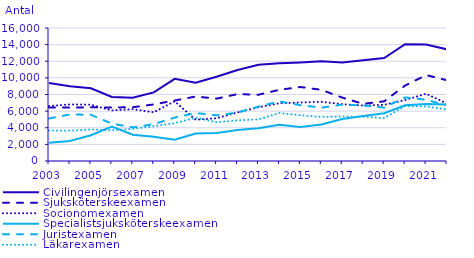
| Category | Civilingenjörsexamen                               | Sjuksköterskeexamen                                | Socionomexamen                                     | Specialistsjuksköterskeexamen                      | Juristexamen                                       | Läkarexamen                                        |
|---|---|---|---|---|---|---|
| 2003.0 | 9394 | 6451 | 6607 | 2193 | 5116 | 3661 |
| 2004.0 | 8998 | 6431 | 6807 | 2407 | 5599 | 3650 |
| 2005.0 | 8755 | 6456 | 6772 | 3095 | 5560 | 3788 |
| 2006.0 | 7711 | 6438 | 6085 | 4136 | 4499 | 3698 |
| 2007.0 | 7616 | 6466 | 6238 | 3169 | 4042 | 3878 |
| 2008.0 | 8249 | 6808 | 5862 | 2906 | 4432 | 4187 |
| 2009.0 | 9889 | 7276 | 7181 | 2551 | 5218 | 4548 |
| 2010.0 | 9407 | 7757 | 4960 | 3318 | 5769 | 5206 |
| 2011.0 | 10127 | 7504 | 5147 | 3378 | 5497 | 4658 |
| 2012.0 | 10948 | 8047 | 5844 | 3739 | 5826 | 4895 |
| 2013.0 | 11568 | 7976 | 6465 | 3931 | 6543 | 5006 |
| 2014.0 | 11750 | 8562 | 6945 | 4374 | 7174 | 5772 |
| 2015.0 | 11848 | 8902 | 7035 | 4081 | 6715 | 5499 |
| 2016.0 | 11992 | 8565 | 7119 | 4401 | 6417 | 5305 |
| 2017.0 | 11843 | 7629 | 6837 | 5056 | 6774 | 5353 |
| 2018.0 | 12129 | 6875 | 6675 | 5408 | 6686 | 5328 |
| 2019.0 | 12392 | 7178 | 6759 | 5754 | 6425 | 5176 |
| 2020.0 | 14042 | 9079 | 7336 | 6703 | 7652 | 6613 |
| 2021.0 | 14012 | 10337 | 8086 | 6865 | 7376 | 6567 |
| 2022.0 | 13432 | 9707 | 6911 | 6783 | 6672 | 6193 |